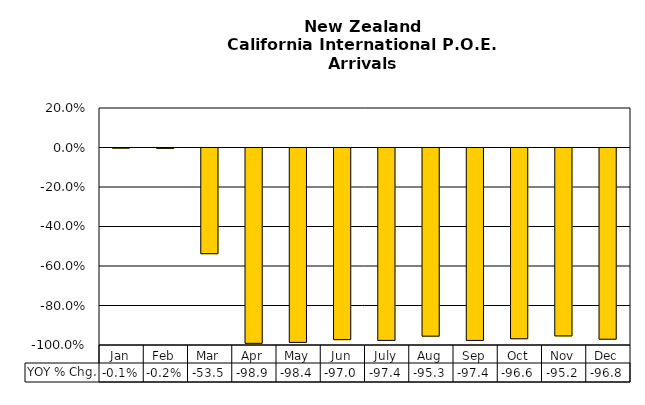
| Category | YOY % Chg. |
|---|---|
| Jan | -0.001 |
| Feb | -0.002 |
| Mar | -0.535 |
| Apr | -0.989 |
| May | -0.984 |
| Jun | -0.97 |
| July | -0.974 |
| Aug | -0.953 |
| Sep | -0.974 |
| Oct | -0.966 |
| Nov | -0.952 |
| Dec | -0.968 |